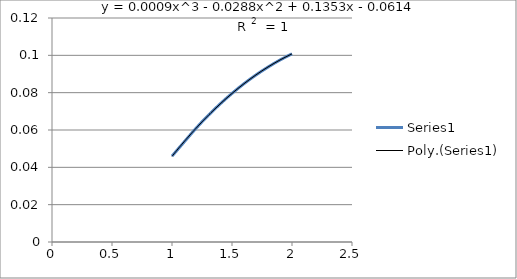
| Category | Series 0 |
|---|---|
| 1.0 | 0.046 |
| 1.1 | 0.054 |
| 1.2 | 0.061 |
| 1.3 | 0.068 |
| 1.4 | 0.074 |
| 1.5 | 0.08 |
| 1.6 | 0.085 |
| 1.7 | 0.09 |
| 1.8 | 0.094 |
| 1.9 | 0.098 |
| 2.0 | 0.101 |